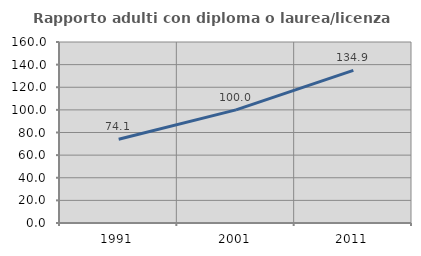
| Category | Rapporto adulti con diploma o laurea/licenza media  |
|---|---|
| 1991.0 | 74.06 |
| 2001.0 | 99.967 |
| 2011.0 | 134.92 |